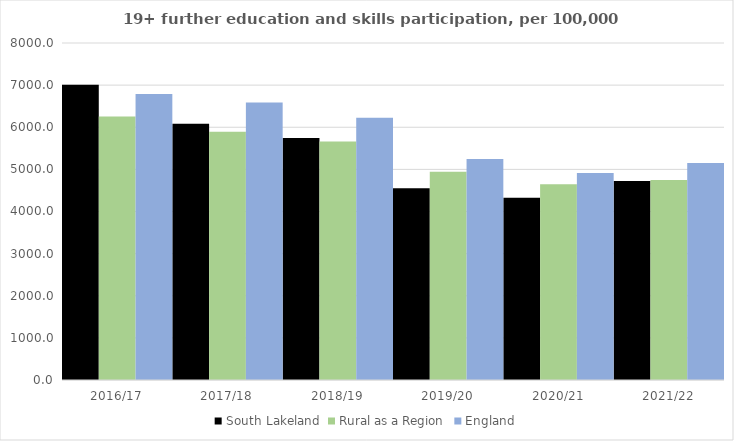
| Category | South Lakeland | Rural as a Region | England |
|---|---|---|---|
| 2016/17 | 7010 | 6253.401 | 6788 |
| 2017/18 | 6085 | 5892.029 | 6588 |
| 2018/19 | 5747 | 5661.873 | 6227 |
| 2019/20 | 4554 | 4943.801 | 5244 |
| 2020/21 | 4329 | 4646.727 | 4913 |
| 2021/22 | 4726 | 4747.049 | 5151 |